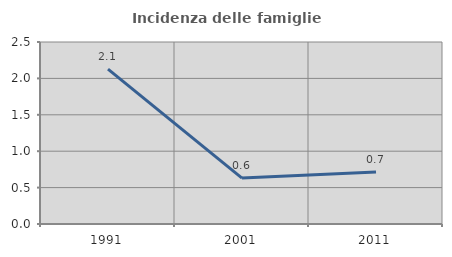
| Category | Incidenza delle famiglie numerose |
|---|---|
| 1991.0 | 2.128 |
| 2001.0 | 0.631 |
| 2011.0 | 0.714 |